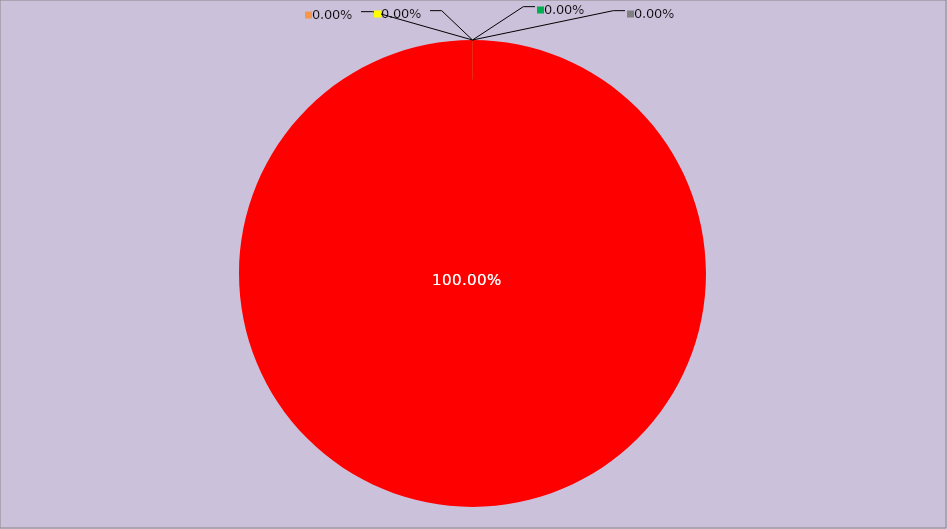
| Category | Année 2025 |
|---|---|
| Mesures non appliquées | 168 |
| Mesures appliquées mais peu ou pas documentées | 0 |
| Mesures appliquées et documentées | 0 |
| Mesures appliquées, documentées et contrôlées | 0 |
| Mesures non applicables | 0 |